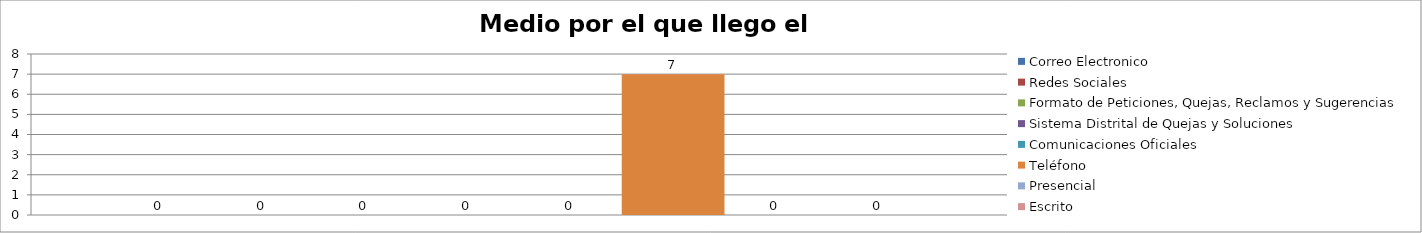
| Category | Correo Electronico | Redes Sociales | Formato de Peticiones, Quejas, Reclamos y Sugerencias | Sistema Distrital de Quejas y Soluciones  | Comunicaciones Oficiales | Teléfono | Presencial | Escrito  |
|---|---|---|---|---|---|---|---|---|
| 0 | 0 | 0 | 0 | 0 | 0 | 7 | 0 | 0 |